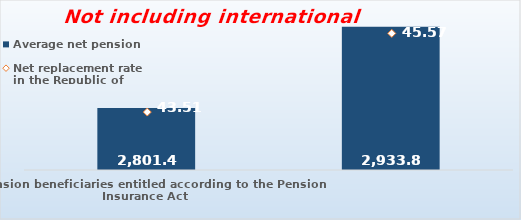
| Category | Average net pension  |
|---|---|
| Pension beneficiaries entitled according to the Pension Insurance Act   | 2801.49 |
| Pension beneficiaries entitled to pension FOR THE FIRST TIME in 2019 according to the Pension Insurance Act  - NEW BENEFICIARIES | 2933.883 |